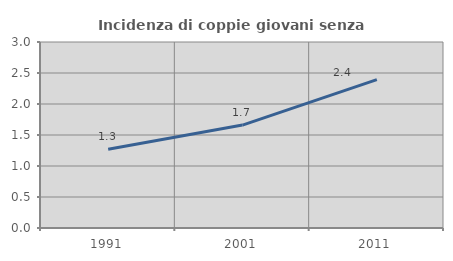
| Category | Incidenza di coppie giovani senza figli |
|---|---|
| 1991.0 | 1.271 |
| 2001.0 | 1.66 |
| 2011.0 | 2.392 |